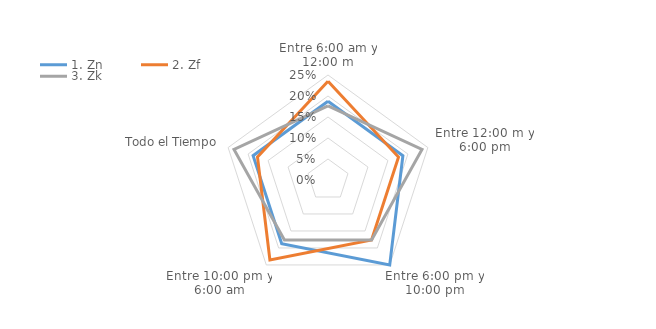
| Category | 1. Zn | 2. Zf | 3. Zk |
|---|---|---|---|
| Entre 6:00 am y 12:00 m | 0.188 | 0.235 | 0.176 |
| Entre 12:00 m y 6:00 pm | 0.188 | 0.176 | 0.235 |
| Entre 6:00 pm y 10:00 pm | 0.25 | 0.176 | 0.176 |
| Entre 10:00 pm y 6:00 am | 0.188 | 0.235 | 0.176 |
| Todo el Tiempo | 0.188 | 0.176 | 0.235 |